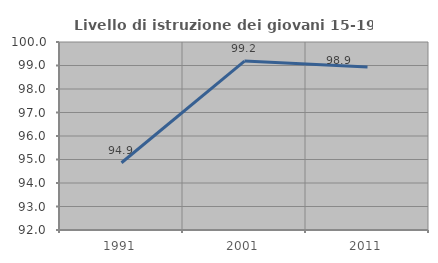
| Category | Livello di istruzione dei giovani 15-19 anni |
|---|---|
| 1991.0 | 94.861 |
| 2001.0 | 99.188 |
| 2011.0 | 98.936 |